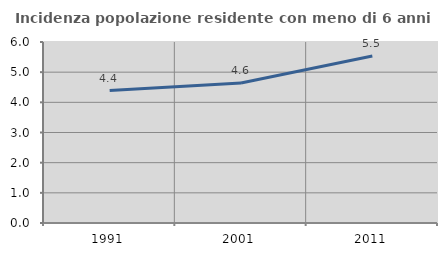
| Category | Incidenza popolazione residente con meno di 6 anni |
|---|---|
| 1991.0 | 4.392 |
| 2001.0 | 4.643 |
| 2011.0 | 5.535 |